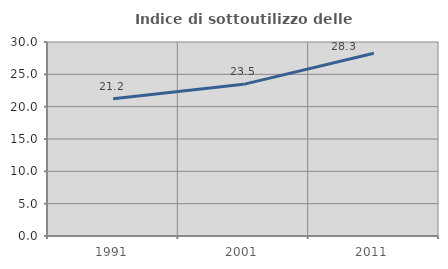
| Category | Indice di sottoutilizzo delle abitazioni  |
|---|---|
| 1991.0 | 21.221 |
| 2001.0 | 23.452 |
| 2011.0 | 28.259 |